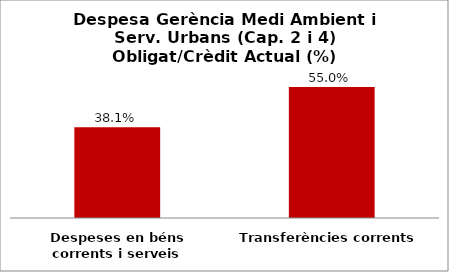
| Category | Series 0 |
|---|---|
| Despeses en béns corrents i serveis | 0.381 |
| Transferències corrents | 0.55 |